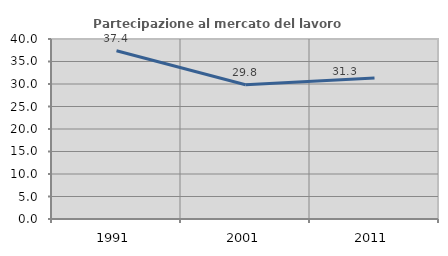
| Category | Partecipazione al mercato del lavoro  femminile |
|---|---|
| 1991.0 | 37.402 |
| 2001.0 | 29.833 |
| 2011.0 | 31.316 |